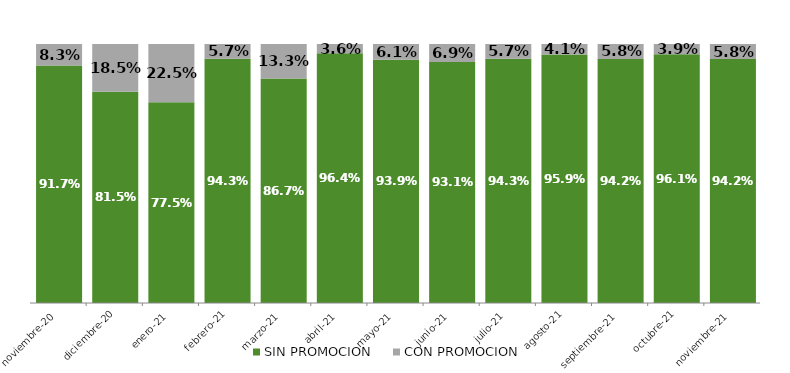
| Category | SIN PROMOCION   | CON PROMOCION   |
|---|---|---|
| 2020-11-01 | 0.917 | 0.083 |
| 2020-12-01 | 0.815 | 0.185 |
| 2021-01-01 | 0.775 | 0.225 |
| 2021-02-01 | 0.943 | 0.057 |
| 2021-03-01 | 0.867 | 0.133 |
| 2021-04-01 | 0.964 | 0.036 |
| 2021-05-01 | 0.939 | 0.061 |
| 2021-06-01 | 0.931 | 0.069 |
| 2021-07-01 | 0.943 | 0.057 |
| 2021-08-01 | 0.959 | 0.041 |
| 2021-09-01 | 0.942 | 0.058 |
| 2021-10-01 | 0.961 | 0.039 |
| 2021-11-01 | 0.942 | 0.058 |